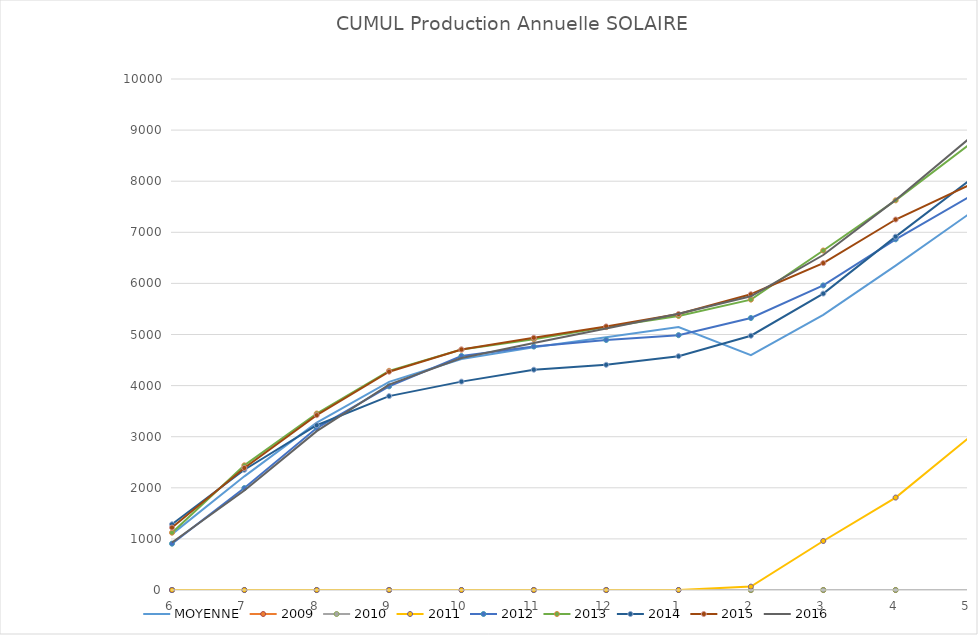
| Category | MOYENNE | 2009 | 2010 | 2011 | 2012 | 2013 | 2014 | 2015 | 2016 |
|---|---|---|---|---|---|---|---|---|---|
| 6 | 1093.2 | 0 | 0 | 0 | 906.875 | 1121.344 | 1285.833 | 1222 | 930 |
| 7 | 2224.2 | 0 | 0 | 0 | 1994.9 | 2439.344 | 2353 | 2388 | 1945.593 |
| 8 | 3275.4 | 0 | 0 | 0 | 3169.75 | 3453.629 | 3224.263 | 3420.829 | 3108.429 |
| 9 | 4072 | 0 | 0 | 0 | 3985.5 | 4289.344 | 3794 | 4271.6 | 4019 |
| 10 | 4521.6 | 0 | 0 | 0 | 4580 | 4704.938 | 4078 | 4706.259 | 4539 |
| 11 | 4750.4 | 0 | 0 | 0 | 4764 | 4907.344 | 4311 | 4936.903 | 4832.636 |
| 12 | 4944.4 | 0 | 0 | 0 | 4893 | 5144.344 | 4406.818 | 5158.742 | 5119 |
| 1 | 5146.4 | 0 | 0 | 0 | 4987 | 5362.344 | 4575.4 | 5401.258 | 5407.118 |
| 2 | 4597 | 0 | 0 | 66.2 | 5323 | 5682.344 | 4976 | 5788 | 5747 |
| 3 | 5386 | 0 | 0 | 959 | 5960 | 6643.344 | 5800.7 | 6397.344 | 6555.818 |
| 4 | 6349.333 | 0 | 0 | 1809 | 6863 | 7625.344 | 6915 | 7250.267 | 7634 |
| 5 | 7344.833 | 0 | 0 | 2967 | 7679.656 | 8699.344 | 7994 | 7913 | 8816 |